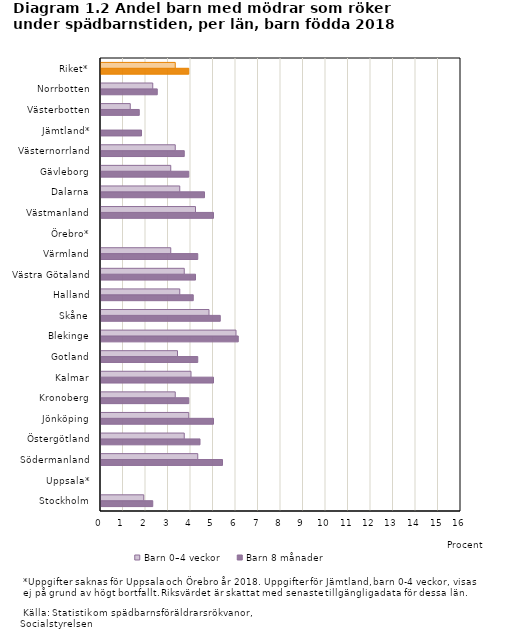
| Category | Barn 8 månader | Barn 0–4 veckor |
|---|---|---|
| Stockholm | 2.3 | 1.9 |
| Uppsala* | 0 | 0 |
| Södermanland | 5.4 | 4.3 |
| Östergötland | 4.4 | 3.7 |
| Jönköping | 5 | 3.9 |
| Kronoberg | 3.9 | 3.3 |
| Kalmar | 5 | 4 |
| Gotland | 4.3 | 3.4 |
| Blekinge | 6.1 | 6 |
| Skåne | 5.3 | 4.8 |
| Halland | 4.1 | 3.5 |
| Västra Götaland | 4.2 | 3.7 |
| Värmland | 4.3 | 3.1 |
| Örebro* | 0 | 0 |
| Västmanland | 5 | 4.2 |
| Dalarna | 4.6 | 3.5 |
| Gävleborg | 3.9 | 3.1 |
| Västernorrland | 3.7 | 3.3 |
| Jämtland* | 1.8 | 0 |
| Västerbotten | 1.7 | 1.3 |
| Norrbotten | 2.5 | 2.3 |
| Riket* | 3.9 | 3.3 |